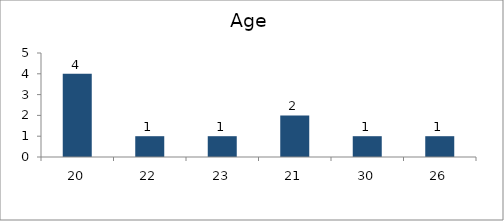
| Category | Age |
|---|---|
| 20.0 | 4 |
| 22.0 | 1 |
| 23.0 | 1 |
| 21.0 | 2 |
| 30.0 | 1 |
| 26.0 | 1 |